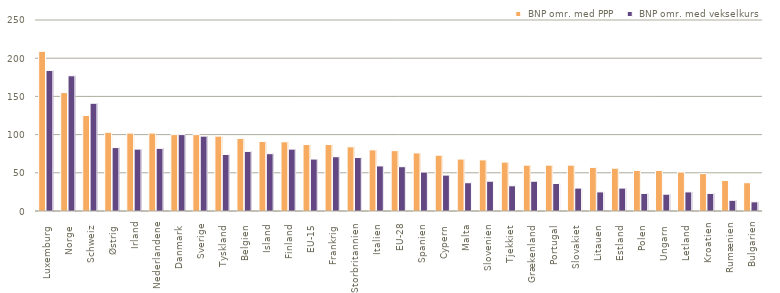
| Category |  BNP omr. med PPP |  BNP omr. med vekselkurs |
|---|---|---|
| Luxemburg  | 209 | 184 |
| Norge  | 155 | 177 |
| Schweiz  | 125 | 141 |
| Østrig  | 103 | 83 |
| Irland | 102 | 81 |
| Nederlandene | 102 | 82 |
| Danmark  | 100 | 100 |
| Sverige | 100 | 98 |
| Tyskland  | 98 | 74 |
| Belgien  | 95 | 78 |
| Island  | 91 | 75 |
| Finland  | 90.551 | 81 |
| EU-15  | 87 | 68 |
| Frankrig  | 87 | 71 |
| Storbritannien  | 84 | 70 |
| Italien  | 80 | 59 |
| EU-28 | 79 | 58 |
| Spanien  | 76 | 51 |
| Cypern  | 73 | 47 |
| Malta  | 68 | 37 |
| Slovenien  | 66.929 | 39 |
| Tjekkiet  | 64 | 33 |
| Grækenland  | 60 | 39 |
| Portugal  | 60 | 36 |
| Slovakiet  | 60 | 30 |
| Litauen  | 57 | 25 |
| Estland  | 56 | 30 |
| Polen  | 53 | 23 |
| Ungarn  | 53 | 22 |
| Letland  | 51 | 25 |
| Kroatien | 49 | 23 |
| Rumænien | 40 | 14 |
| Bulgarien | 37 | 12 |